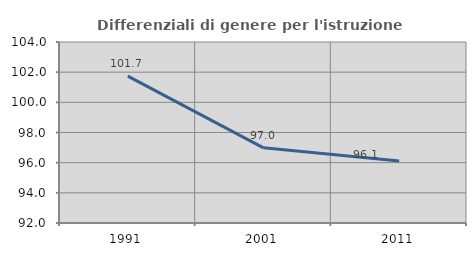
| Category | Differenziali di genere per l'istruzione superiore |
|---|---|
| 1991.0 | 101.733 |
| 2001.0 | 96.982 |
| 2011.0 | 96.105 |